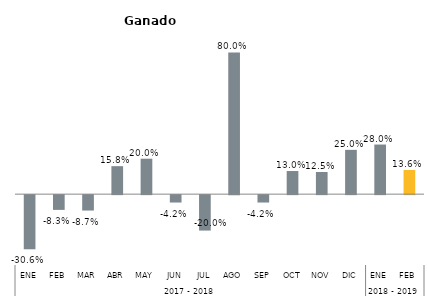
| Category | Jalisco |
|---|---|
| 0 | -0.306 |
| 1 | -0.083 |
| 2 | -0.087 |
| 3 | 0.158 |
| 4 | 0.2 |
| 5 | -0.042 |
| 6 | -0.2 |
| 7 | 0.8 |
| 8 | -0.042 |
| 9 | 0.13 |
| 10 | 0.125 |
| 11 | 0.25 |
| 12 | 0.28 |
| 13 | 0.136 |